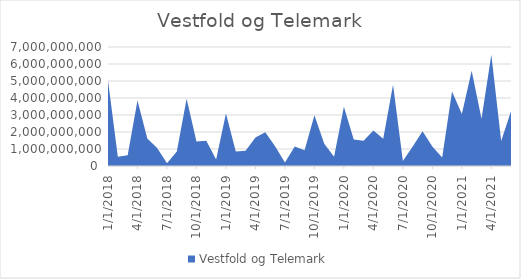
| Category | Vestfold og Telemark |
|---|---|
| 1/1/18 | 5025150000 |
| 2/1/18 | 546700000 |
| 3/1/18 | 633900000 |
| 4/1/18 | 3859645000 |
| 5/1/18 | 1622375000 |
| 6/1/18 | 1052950000 |
| 7/1/18 | 155240000 |
| 8/1/18 | 845850000 |
| 9/1/18 | 3949850000 |
| 10/1/18 | 1448100000 |
| 11/1/18 | 1480750000 |
| 12/1/18 | 375850000 |
| 1/1/19 | 3087050000 |
| 2/1/19 | 851000000 |
| 3/1/19 | 898100000 |
| 4/1/19 | 1680960000 |
| 5/1/19 | 1985000000 |
| 6/1/19 | 1166550000 |
| 7/1/19 | 210400000 |
| 8/1/19 | 1151850000 |
| 9/1/19 | 925100000 |
| 10/1/19 | 2983900000 |
| 11/1/19 | 1303550000 |
| 12/1/19 | 537700000 |
| 1/1/20 | 3481780000 |
| 2/1/20 | 1558650000 |
| 3/1/20 | 1482600000 |
| 4/1/20 | 2082950000 |
| 5/1/20 | 1600400000 |
| 6/1/20 | 4777700000 |
| 7/1/20 | 289700000 |
| 8/1/20 | 1150350000 |
| 9/1/20 | 2045595000 |
| 10/1/20 | 1148300000 |
| 11/1/20 | 492900000 |
| 12/1/20 | 4385000000 |
| 1/1/21 | 3052700000 |
| 2/1/21 | 5597300000 |
| 3/1/21 | 2785330000 |
| 4/1/21 | 6545100000 |
| 5/1/21 | 1463550000 |
| 6/1/21 | 3227375000 |